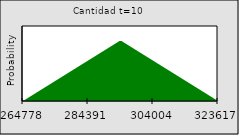
| Category | Series 0 |
|---|---|
| 264777.881785048 | 0 |
| nan | 0 |
| nan | 0.001 |
| nan | 0.001 |
| nan | 0.002 |
| nan | 0.002 |
| nan | 0.002 |
| nan | 0.003 |
| nan | 0.003 |
| nan | 0.004 |
| nan | 0.004 |
| nan | 0.004 |
| nan | 0.005 |
| nan | 0.005 |
| nan | 0.006 |
| nan | 0.006 |
| nan | 0.007 |
| nan | 0.007 |
| nan | 0.007 |
| nan | 0.008 |
| nan | 0.008 |
| nan | 0.009 |
| nan | 0.009 |
| nan | 0.009 |
| nan | 0.01 |
| nan | 0.01 |
| nan | 0.011 |
| nan | 0.011 |
| nan | 0.011 |
| nan | 0.012 |
| nan | 0.012 |
| nan | 0.013 |
| nan | 0.013 |
| 284391.05821357 | 0.013 |
| nan | 0.014 |
| nan | 0.014 |
| nan | 0.015 |
| nan | 0.015 |
| nan | 0.016 |
| nan | 0.016 |
| nan | 0.016 |
| nan | 0.017 |
| nan | 0.017 |
| nan | 0.018 |
| nan | 0.018 |
| nan | 0.018 |
| nan | 0.019 |
| nan | 0.019 |
| nan | 0.02 |
| nan | 0.02 |
| nan | 0.02 |
| nan | 0.02 |
| nan | 0.019 |
| nan | 0.019 |
| nan | 0.018 |
| nan | 0.018 |
| nan | 0.018 |
| nan | 0.017 |
| nan | 0.017 |
| nan | 0.016 |
| nan | 0.016 |
| nan | 0.016 |
| nan | 0.015 |
| nan | 0.015 |
| nan | 0.014 |
| nan | 0.014 |
| 304004.234642092 | 0.013 |
| nan | 0.013 |
| nan | 0.013 |
| nan | 0.012 |
| nan | 0.012 |
| nan | 0.011 |
| nan | 0.011 |
| nan | 0.011 |
| nan | 0.01 |
| nan | 0.01 |
| nan | 0.009 |
| nan | 0.009 |
| nan | 0.009 |
| nan | 0.008 |
| nan | 0.008 |
| nan | 0.007 |
| nan | 0.007 |
| nan | 0.007 |
| nan | 0.006 |
| nan | 0.006 |
| nan | 0.005 |
| nan | 0.005 |
| nan | 0.004 |
| nan | 0.004 |
| nan | 0.004 |
| nan | 0.003 |
| nan | 0.003 |
| nan | 0.002 |
| nan | 0.002 |
| nan | 0.002 |
| nan | 0.001 |
| nan | 0.001 |
| nan | 0 |
| 323617.411070614 | 0 |